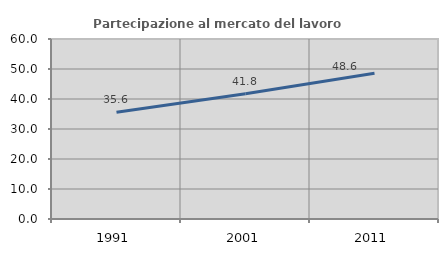
| Category | Partecipazione al mercato del lavoro  femminile |
|---|---|
| 1991.0 | 35.604 |
| 2001.0 | 41.785 |
| 2011.0 | 48.586 |